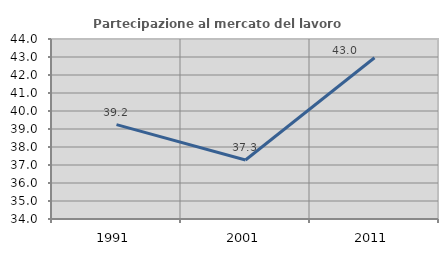
| Category | Partecipazione al mercato del lavoro  femminile |
|---|---|
| 1991.0 | 39.245 |
| 2001.0 | 37.276 |
| 2011.0 | 42.96 |